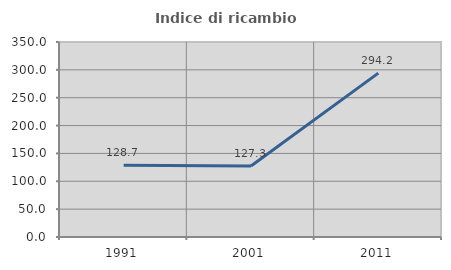
| Category | Indice di ricambio occupazionale  |
|---|---|
| 1991.0 | 128.747 |
| 2001.0 | 127.303 |
| 2011.0 | 294.186 |